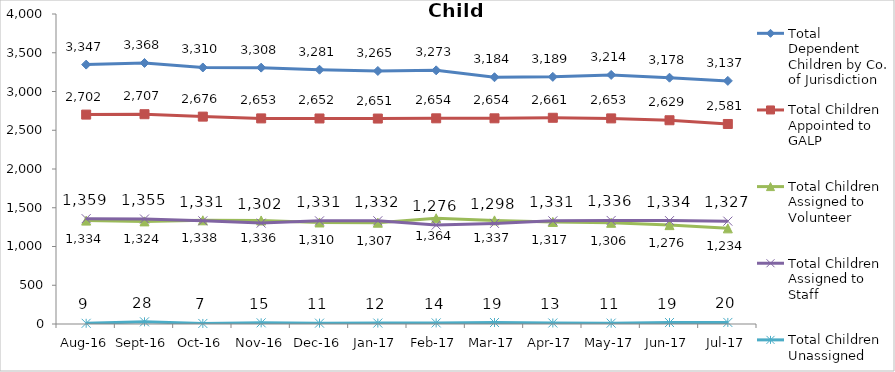
| Category | Total Dependent Children by Co. of Jurisdiction | Total Children Appointed to GALP | Total Children Assigned to Volunteer | Total Children Assigned to Staff | Total Children Unassigned |
|---|---|---|---|---|---|
| Aug-16 | 3347 | 2702 | 1334 | 1359 | 9 |
| Sep-16 | 3368 | 2707 | 1324 | 1355 | 28 |
| Oct-16 | 3310 | 2676 | 1338 | 1331 | 7 |
| Nov-16 | 3308 | 2653 | 1336 | 1302 | 15 |
| Dec-16 | 3281 | 2652 | 1310 | 1331 | 11 |
| Jan-17 | 3265 | 2651 | 1307 | 1332 | 12 |
| Feb-17 | 3273 | 2654 | 1364 | 1276 | 14 |
| Mar-17 | 3184 | 2654 | 1337 | 1298 | 19 |
| Apr-17 | 3189 | 2661 | 1317 | 1331 | 13 |
| May-17 | 3214 | 2653 | 1306 | 1336 | 11 |
| Jun-17 | 3178 | 2629 | 1276 | 1334 | 19 |
| Jul-17 | 3137 | 2581 | 1234 | 1327 | 20 |